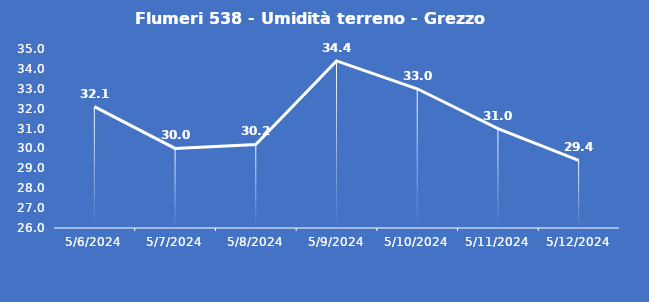
| Category | Flumeri 538 - Umidità terreno - Grezzo (%VWC) |
|---|---|
| 5/6/24 | 32.1 |
| 5/7/24 | 30 |
| 5/8/24 | 30.2 |
| 5/9/24 | 34.4 |
| 5/10/24 | 33 |
| 5/11/24 | 31 |
| 5/12/24 | 29.4 |